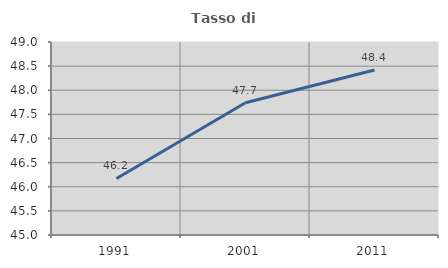
| Category | Tasso di occupazione   |
|---|---|
| 1991.0 | 46.172 |
| 2001.0 | 47.742 |
| 2011.0 | 48.419 |